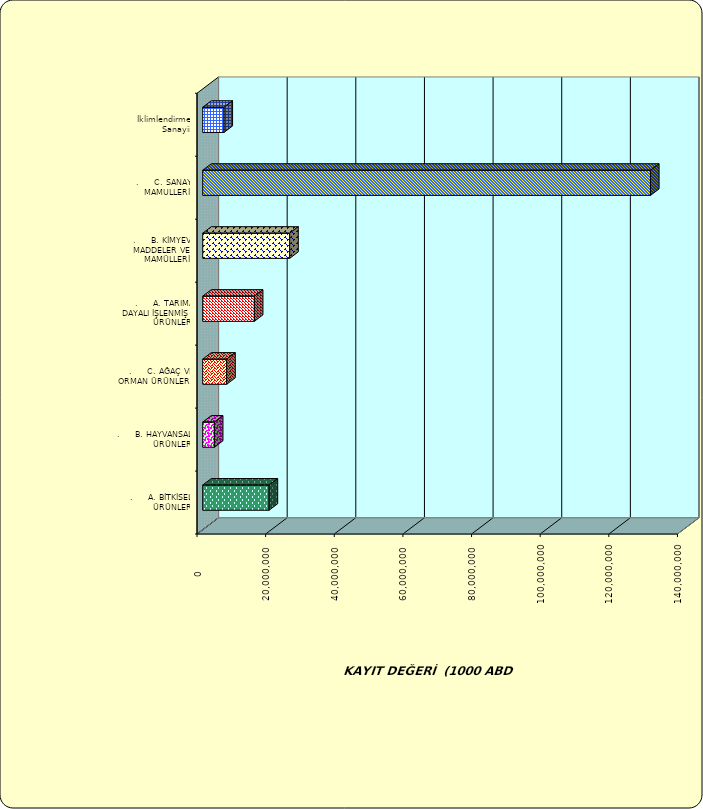
| Category | Series 0 |
|---|---|
| .     A. BİTKİSEL ÜRÜNLER | 19343587.897 |
| .     B. HAYVANSAL ÜRÜNLER | 3400153.671 |
| .     C. AĞAÇ VE ORMAN ÜRÜNLERİ | 6993833.112 |
| .     A. TARIMA DAYALI İŞLENMİŞ ÜRÜNLER | 15051777.245 |
| .     B. KİMYEVİ MADDELER VE MAMÜLLERİ | 25348548.325 |
| .     C. SANAYİ MAMULLERİ | 130480084.627 |
|  İklimlendirme Sanayii | 6196123.821 |